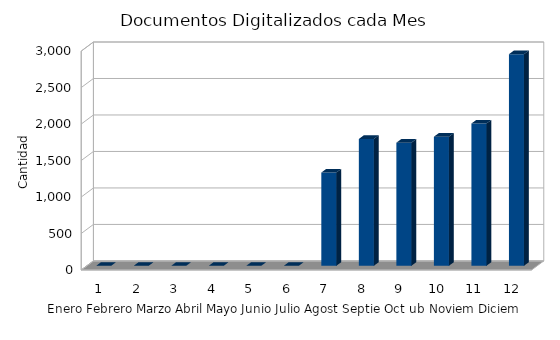
| Category | Series 0 |
|---|---|
| 0 | 0 |
| 1 | 0 |
| 2 | 0 |
| 3 | 0 |
| 4 | 0 |
| 5 | 0 |
| 6 | 1278 |
| 7 | 1738 |
| 8 | 1687 |
| 9 | 1769 |
| 10 | 1950 |
| 11 | 2900 |